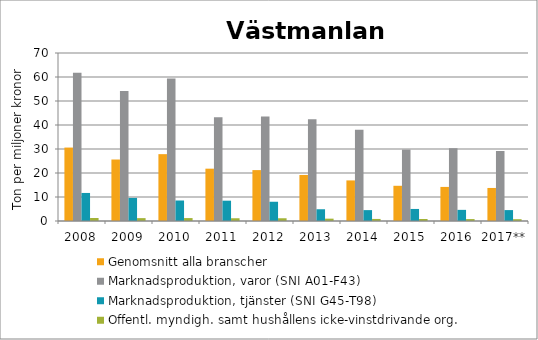
| Category | Genomsnitt alla branscher | Marknadsproduktion, varor (SNI A01-F43) | Marknadsproduktion, tjänster (SNI G45-T98) | Offentl. myndigh. samt hushållens icke-vinstdrivande org. |
|---|---|---|---|---|
| 2008 | 30.598 | 61.722 | 11.684 | 1.246 |
| 2009 | 25.623 | 54.189 | 9.622 | 1.195 |
| 2010 | 27.853 | 59.398 | 8.542 | 1.219 |
| 2011 | 21.801 | 43.202 | 8.465 | 1.143 |
| 2012 | 21.206 | 43.516 | 8.023 | 1.143 |
| 2013 | 19.186 | 42.416 | 4.897 | 0.978 |
| 2014 | 16.913 | 38.051 | 4.536 | 0.859 |
| 2015 | 14.671 | 29.746 | 5.019 | 0.823 |
| 2016 | 14.2 | 30.339 | 4.639 | 0.799 |
| 2017** | 13.769 | 29.17 | 4.546 | 0.749 |